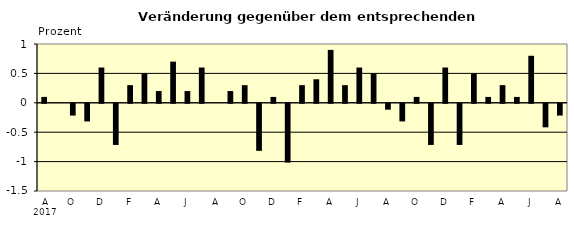
| Category | Series 0 |
|---|---|
| 0 | 0.1 |
| 1 | 0 |
| 2 | -0.2 |
| 3 | -0.3 |
| 4 | 0.6 |
| 5 | -0.7 |
| 6 | 0.3 |
| 7 | 0.5 |
| 8 | 0.2 |
| 9 | 0.7 |
| 10 | 0.2 |
| 11 | 0.6 |
| 12 | 0 |
| 13 | 0.2 |
| 14 | 0.3 |
| 15 | -0.8 |
| 16 | 0.1 |
| 17 | -1 |
| 18 | 0.3 |
| 19 | 0.4 |
| 20 | 0.9 |
| 21 | 0.3 |
| 22 | 0.6 |
| 23 | 0.5 |
| 24 | -0.1 |
| 25 | -0.3 |
| 26 | 0.1 |
| 27 | -0.7 |
| 28 | 0.6 |
| 29 | -0.7 |
| 30 | 0.5 |
| 31 | 0.1 |
| 32 | 0.3 |
| 33 | 0.1 |
| 34 | 0.8 |
| 35 | -0.4 |
| 36 | -0.2 |